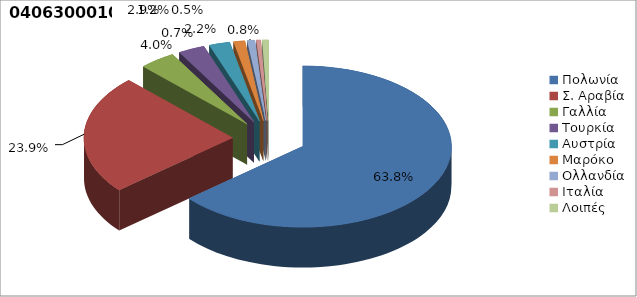
| Category | Series 0 |
|---|---|
| Πολωνία | 0.638 |
| Σ. Αραβία | 0.239 |
| Γαλλία | 0.04 |
| Τουρκία | 0.029 |
| Αυστρία | 0.022 |
| Μαρόκο | 0.012 |
| Ολλανδία | 0.008 |
| Ιταλία | 0.005 |
| Λοιπές | 0.007 |